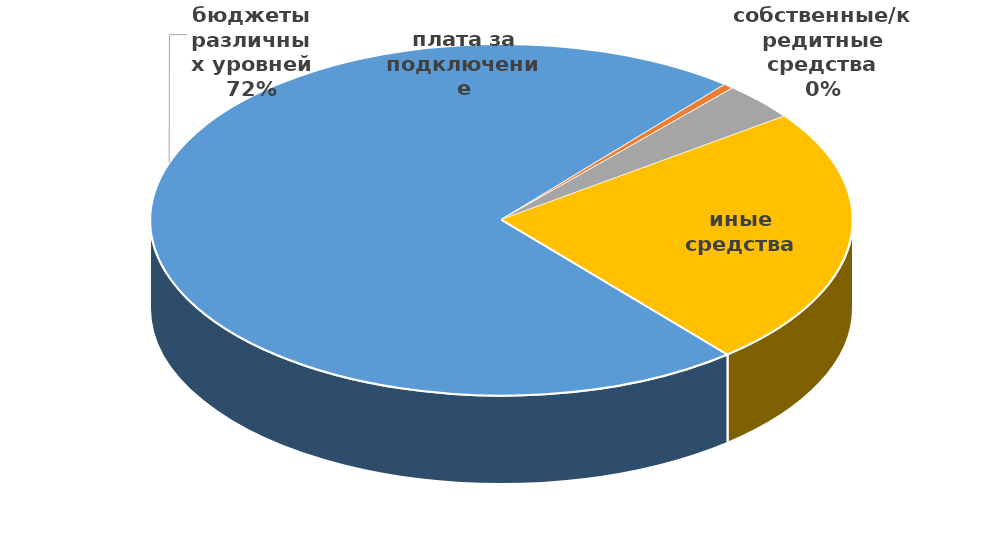
| Category | Потребность в капитальных вложениях, в т.ч.: |
|---|---|
| бюджеты различных уровней | 6914099.262 |
| собственные/кредитные средства | 46393.699 |
| плата за подключение | 333028.603 |
| иные средства | 2295099.178 |